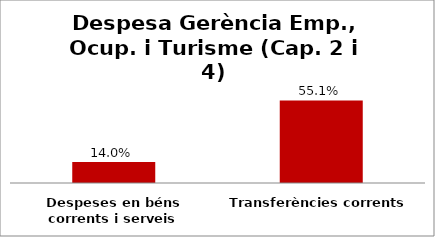
| Category | Series 0 |
|---|---|
| Despeses en béns corrents i serveis | 0.14 |
| Transferències corrents | 0.551 |